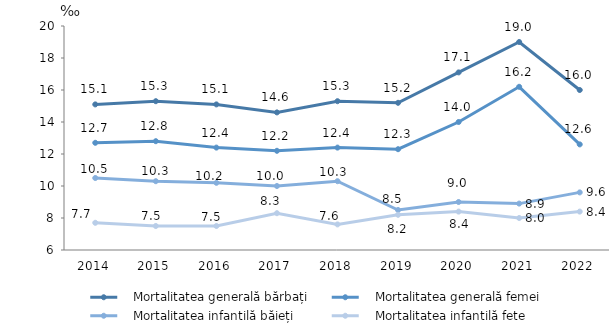
| Category | Series 0 | Series 1 | Series 2 | Series 3 |
|---|---|---|---|---|
| 2014.0 | 15.1 | 12.7 | 10.5 | 7.7 |
| 2015.0 | 15.3 | 12.8 | 10.3 | 7.5 |
| 2016.0 | 15.1 | 12.4 | 10.2 | 7.5 |
| 2017.0 | 14.6 | 12.2 | 10 | 8.3 |
| 2018.0 | 15.3 | 12.4 | 10.3 | 7.6 |
| 2019.0 | 15.2 | 12.3 | 8.5 | 8.2 |
| 2020.0 | 17.1 | 14 | 9 | 8.4 |
| 2021.0 | 19 | 16.2 | 8.9 | 8 |
| 2022.0 | 16 | 12.6 | 9.6 | 8.4 |